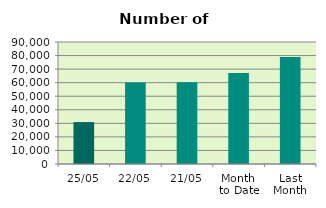
| Category | Series 0 |
|---|---|
| 25/05 | 30928 |
| 22/05 | 60178 |
| 21/05 | 60320 |
| Month 
to Date | 67176.75 |
| Last
Month | 78959.6 |